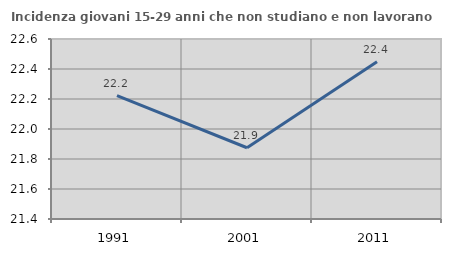
| Category | Incidenza giovani 15-29 anni che non studiano e non lavorano  |
|---|---|
| 1991.0 | 22.222 |
| 2001.0 | 21.875 |
| 2011.0 | 22.449 |